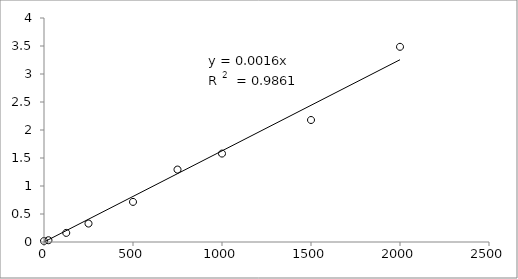
| Category | Series 0 |
|---|---|
| 2000.0 | 3.486 |
| 1500.0 | 2.178 |
| 1000.0 | 1.579 |
| 750.0 | 1.293 |
| 500.0 | 0.716 |
| 250.0 | 0.33 |
| 125.0 | 0.162 |
| 25.0 | 0.032 |
| 0.0 | 0.018 |